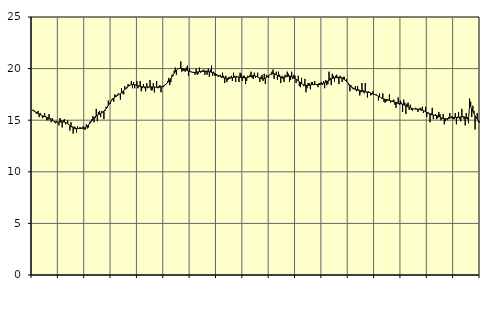
| Category | Piggar | Series 1 |
|---|---|---|
| nan | 16 | 15.95 |
| 87.0 | 16 | 15.89 |
| 87.0 | 15.9 | 15.84 |
| 87.0 | 15.7 | 15.78 |
| 87.0 | 15.6 | 15.72 |
| 87.0 | 15.9 | 15.66 |
| 87.0 | 15.3 | 15.59 |
| 87.0 | 15.7 | 15.54 |
| 87.0 | 15.5 | 15.48 |
| 87.0 | 15.2 | 15.43 |
| 87.0 | 15.3 | 15.39 |
| 87.0 | 15.7 | 15.35 |
| nan | 15.4 | 15.31 |
| 88.0 | 15 | 15.26 |
| 88.0 | 15 | 15.21 |
| 88.0 | 15.6 | 15.16 |
| 88.0 | 15.2 | 15.1 |
| 88.0 | 14.8 | 15.04 |
| 88.0 | 15.2 | 14.98 |
| 88.0 | 14.9 | 14.92 |
| 88.0 | 14.8 | 14.88 |
| 88.0 | 14.7 | 14.84 |
| 88.0 | 14.9 | 14.82 |
| 88.0 | 14.8 | 14.81 |
| nan | 14.5 | 14.81 |
| 89.0 | 15.2 | 14.82 |
| 89.0 | 15 | 14.84 |
| 89.0 | 14.3 | 14.85 |
| 89.0 | 15 | 14.84 |
| 89.0 | 15.1 | 14.82 |
| 89.0 | 14.6 | 14.79 |
| 89.0 | 14.7 | 14.73 |
| 89.0 | 15 | 14.66 |
| 89.0 | 14.6 | 14.58 |
| 89.0 | 14 | 14.49 |
| 89.0 | 14.8 | 14.4 |
| nan | 14.4 | 14.33 |
| 90.0 | 13.7 | 14.26 |
| 90.0 | 14.4 | 14.21 |
| 90.0 | 14.3 | 14.19 |
| 90.0 | 13.8 | 14.18 |
| 90.0 | 14.4 | 14.18 |
| 90.0 | 14.2 | 14.19 |
| 90.0 | 14.3 | 14.19 |
| 90.0 | 14.3 | 14.2 |
| 90.0 | 14.2 | 14.21 |
| 90.0 | 14.4 | 14.23 |
| 90.0 | 14.1 | 14.25 |
| nan | 14.1 | 14.3 |
| 91.0 | 14.6 | 14.36 |
| 91.0 | 14.2 | 14.44 |
| 91.0 | 14.3 | 14.55 |
| 91.0 | 14.8 | 14.67 |
| 91.0 | 14.9 | 14.81 |
| 91.0 | 15.1 | 14.95 |
| 91.0 | 15.4 | 15.09 |
| 91.0 | 14.8 | 15.22 |
| 91.0 | 15.2 | 15.33 |
| 91.0 | 16.1 | 15.42 |
| 91.0 | 14.9 | 15.48 |
| nan | 15.8 | 15.54 |
| 92.0 | 15.9 | 15.59 |
| 92.0 | 15.3 | 15.64 |
| 92.0 | 15.9 | 15.71 |
| 92.0 | 15.8 | 15.79 |
| 92.0 | 15.1 | 15.88 |
| 92.0 | 15.9 | 16 |
| 92.0 | 16.3 | 16.13 |
| 92.0 | 16.2 | 16.28 |
| 92.0 | 16.9 | 16.44 |
| 92.0 | 16.6 | 16.6 |
| 92.0 | 16.6 | 16.75 |
| nan | 17 | 16.9 |
| 93.0 | 17.1 | 17.03 |
| 93.0 | 16.8 | 17.14 |
| 93.0 | 17.5 | 17.23 |
| 93.0 | 17.4 | 17.3 |
| 93.0 | 17.4 | 17.37 |
| 93.0 | 17.6 | 17.44 |
| 93.0 | 17.5 | 17.51 |
| 93.0 | 17 | 17.58 |
| 93.0 | 18.1 | 17.66 |
| 93.0 | 17.6 | 17.76 |
| 93.0 | 17.5 | 17.86 |
| nan | 18.3 | 17.98 |
| 94.0 | 18 | 18.09 |
| 94.0 | 18.1 | 18.2 |
| 94.0 | 18.5 | 18.29 |
| 94.0 | 18.3 | 18.36 |
| 94.0 | 18.4 | 18.41 |
| 94.0 | 18.8 | 18.44 |
| 94.0 | 18.1 | 18.45 |
| 94.0 | 18.7 | 18.45 |
| 94.0 | 18.1 | 18.44 |
| 94.0 | 18.4 | 18.41 |
| 94.0 | 18.8 | 18.38 |
| nan | 18.1 | 18.35 |
| 95.0 | 18.3 | 18.31 |
| 95.0 | 18.8 | 18.28 |
| 95.0 | 17.8 | 18.25 |
| 95.0 | 18.1 | 18.23 |
| 95.0 | 18.5 | 18.22 |
| 95.0 | 18.1 | 18.22 |
| 95.0 | 17.8 | 18.22 |
| 95.0 | 18.6 | 18.22 |
| 95.0 | 18.1 | 18.22 |
| 95.0 | 18.2 | 18.22 |
| 95.0 | 18.9 | 18.23 |
| nan | 17.9 | 18.23 |
| 96.0 | 17.9 | 18.23 |
| 96.0 | 18.6 | 18.22 |
| 96.0 | 17.7 | 18.22 |
| 96.0 | 18.2 | 18.21 |
| 96.0 | 18.8 | 18.2 |
| 96.0 | 18.1 | 18.19 |
| 96.0 | 18.3 | 18.19 |
| 96.0 | 18.4 | 18.21 |
| 96.0 | 17.7 | 18.23 |
| 96.0 | 18.3 | 18.26 |
| 96.0 | 18.2 | 18.3 |
| nan | 18.3 | 18.36 |
| 97.0 | 18.5 | 18.43 |
| 97.0 | 18.6 | 18.52 |
| 97.0 | 18.8 | 18.64 |
| 97.0 | 19.1 | 18.77 |
| 97.0 | 18.4 | 18.91 |
| 97.0 | 18.7 | 19.06 |
| 97.0 | 19.4 | 19.22 |
| 97.0 | 19.3 | 19.39 |
| 97.0 | 19.8 | 19.55 |
| 97.0 | 20.1 | 19.7 |
| 97.0 | 19.4 | 19.83 |
| nan | 19.9 | 19.93 |
| 98.0 | 20 | 20 |
| 98.0 | 20 | 20.03 |
| 98.0 | 20.7 | 20.04 |
| 98.0 | 19.7 | 20.02 |
| 98.0 | 19.8 | 19.99 |
| 98.0 | 19.8 | 19.95 |
| 98.0 | 19.7 | 19.9 |
| 98.0 | 20.1 | 19.86 |
| 98.0 | 20.3 | 19.81 |
| 98.0 | 19.3 | 19.77 |
| 98.0 | 20 | 19.72 |
| nan | 19.7 | 19.69 |
| 99.0 | 19.7 | 19.66 |
| 99.0 | 19.6 | 19.64 |
| 99.0 | 19.6 | 19.63 |
| 99.0 | 19.4 | 19.63 |
| 99.0 | 20 | 19.64 |
| 99.0 | 19.4 | 19.66 |
| 99.0 | 19.5 | 19.69 |
| 99.0 | 20.1 | 19.71 |
| 99.0 | 19.6 | 19.72 |
| 99.0 | 19.8 | 19.73 |
| 99.0 | 19.8 | 19.73 |
| nan | 19.9 | 19.73 |
| 0.0 | 19.4 | 19.73 |
| 0.0 | 19.8 | 19.72 |
| 0.0 | 19.4 | 19.72 |
| 0.0 | 20 | 19.71 |
| 0.0 | 19.2 | 19.69 |
| 0.0 | 19.9 | 19.67 |
| 0.0 | 20.3 | 19.64 |
| 0.0 | 19.3 | 19.6 |
| 0.0 | 19.7 | 19.55 |
| 0.0 | 19.3 | 19.5 |
| 0.0 | 19.3 | 19.45 |
| nan | 19.4 | 19.4 |
| 1.0 | 19.2 | 19.35 |
| 1.0 | 19.3 | 19.3 |
| 1.0 | 19.4 | 19.25 |
| 1.0 | 19.1 | 19.21 |
| 1.0 | 19.6 | 19.17 |
| 1.0 | 19.3 | 19.13 |
| 1.0 | 18.6 | 19.1 |
| 1.0 | 19.3 | 19.07 |
| 1.0 | 18.7 | 19.05 |
| 1.0 | 18.9 | 19.05 |
| 1.0 | 19.2 | 19.06 |
| nan | 19.1 | 19.07 |
| 2.0 | 19.3 | 19.1 |
| 2.0 | 18.8 | 19.12 |
| 2.0 | 19.6 | 19.15 |
| 2.0 | 19.3 | 19.17 |
| 2.0 | 18.7 | 19.19 |
| 2.0 | 19.3 | 19.19 |
| 2.0 | 19.2 | 19.19 |
| 2.0 | 18.7 | 19.18 |
| 2.0 | 19.6 | 19.16 |
| 2.0 | 19.5 | 19.14 |
| 2.0 | 18.8 | 19.12 |
| nan | 19.3 | 19.11 |
| 3.0 | 19.3 | 19.1 |
| 3.0 | 18.5 | 19.11 |
| 3.0 | 18.8 | 19.12 |
| 3.0 | 19.3 | 19.15 |
| 3.0 | 19.2 | 19.18 |
| 3.0 | 19.4 | 19.23 |
| 3.0 | 19.7 | 19.27 |
| 3.0 | 19.1 | 19.3 |
| 3.0 | 19 | 19.32 |
| 3.0 | 19.6 | 19.31 |
| 3.0 | 19.1 | 19.28 |
| nan | 19.2 | 19.24 |
| 4.0 | 19.6 | 19.18 |
| 4.0 | 19.1 | 19.12 |
| 4.0 | 18.7 | 19.07 |
| 4.0 | 19.2 | 19.03 |
| 4.0 | 19.4 | 19.01 |
| 4.0 | 18.8 | 19.01 |
| 4.0 | 19.5 | 19.03 |
| 4.0 | 18.5 | 19.08 |
| 4.0 | 19.4 | 19.14 |
| 4.0 | 19.3 | 19.22 |
| 4.0 | 19.1 | 19.3 |
| nan | 19.4 | 19.38 |
| 5.0 | 19.5 | 19.44 |
| 5.0 | 19.7 | 19.49 |
| 5.0 | 19.9 | 19.5 |
| 5.0 | 19 | 19.5 |
| 5.0 | 19.4 | 19.46 |
| 5.0 | 19.7 | 19.4 |
| 5.0 | 18.9 | 19.34 |
| 5.0 | 19.7 | 19.27 |
| 5.0 | 19.4 | 19.22 |
| 5.0 | 18.6 | 19.18 |
| 5.0 | 19.3 | 19.16 |
| nan | 19 | 19.16 |
| 6.0 | 18.7 | 19.17 |
| 6.0 | 19.4 | 19.19 |
| 6.0 | 19.3 | 19.21 |
| 6.0 | 19.7 | 19.24 |
| 6.0 | 19.5 | 19.27 |
| 6.0 | 18.7 | 19.28 |
| 6.0 | 18.9 | 19.27 |
| 6.0 | 19.7 | 19.24 |
| 6.0 | 19 | 19.19 |
| 6.0 | 19.4 | 19.13 |
| 6.0 | 19.3 | 19.06 |
| nan | 18.6 | 18.98 |
| 7.0 | 18.9 | 18.9 |
| 7.0 | 19.3 | 18.81 |
| 7.0 | 18.3 | 18.72 |
| 7.0 | 18.2 | 18.64 |
| 7.0 | 19.1 | 18.55 |
| 7.0 | 18.5 | 18.48 |
| 7.0 | 18.3 | 18.43 |
| 7.0 | 19 | 18.4 |
| 7.0 | 17.7 | 18.38 |
| 7.0 | 18.1 | 18.38 |
| 7.0 | 18.6 | 18.39 |
| nan | 18.6 | 18.4 |
| 8.0 | 18 | 18.42 |
| 8.0 | 18.7 | 18.44 |
| 8.0 | 18.7 | 18.45 |
| 8.0 | 18.4 | 18.46 |
| 8.0 | 18.8 | 18.47 |
| 8.0 | 18.5 | 18.46 |
| 8.0 | 18.4 | 18.46 |
| 8.0 | 18.2 | 18.46 |
| 8.0 | 18.6 | 18.46 |
| 8.0 | 18.6 | 18.48 |
| 8.0 | 18.7 | 18.5 |
| nan | 18.4 | 18.54 |
| 9.0 | 18.8 | 18.58 |
| 9.0 | 18.1 | 18.63 |
| 9.0 | 18.9 | 18.68 |
| 9.0 | 18.4 | 18.74 |
| 9.0 | 18.5 | 18.8 |
| 9.0 | 19.7 | 18.87 |
| 9.0 | 19.1 | 18.93 |
| 9.0 | 18.4 | 18.99 |
| 9.0 | 19.5 | 19.04 |
| 9.0 | 19.3 | 19.08 |
| 9.0 | 18.7 | 19.1 |
| nan | 19.3 | 19.12 |
| 10.0 | 19.4 | 19.12 |
| 10.0 | 19.2 | 19.12 |
| 10.0 | 18.5 | 19.12 |
| 10.0 | 19.3 | 19.11 |
| 10.0 | 19.2 | 19.09 |
| 10.0 | 18.7 | 19.06 |
| 10.0 | 19.2 | 19.01 |
| 10.0 | 19.2 | 18.94 |
| 10.0 | 18.8 | 18.85 |
| 10.0 | 19 | 18.74 |
| 10.0 | 18.7 | 18.62 |
| nan | 18.4 | 18.5 |
| 11.0 | 17.8 | 18.38 |
| 11.0 | 18.4 | 18.27 |
| 11.0 | 18.1 | 18.18 |
| 11.0 | 18 | 18.11 |
| 11.0 | 18 | 18.05 |
| 11.0 | 18.3 | 17.99 |
| 11.0 | 17.8 | 17.96 |
| 11.0 | 18.3 | 17.92 |
| 11.0 | 18 | 17.89 |
| 11.0 | 17.4 | 17.87 |
| 11.0 | 17.7 | 17.84 |
| nan | 18.6 | 17.82 |
| 12.0 | 17.9 | 17.8 |
| 12.0 | 17.6 | 17.78 |
| 12.0 | 18.6 | 17.76 |
| 12.0 | 17.7 | 17.75 |
| 12.0 | 17.2 | 17.73 |
| 12.0 | 17.8 | 17.7 |
| 12.0 | 17.7 | 17.67 |
| 12.0 | 17.4 | 17.63 |
| 12.0 | 17.5 | 17.59 |
| 12.0 | 17.8 | 17.54 |
| 12.0 | 17.5 | 17.51 |
| nan | 17.5 | 17.47 |
| 13.0 | 17.5 | 17.43 |
| 13.0 | 17.4 | 17.39 |
| 13.0 | 16.9 | 17.33 |
| 13.0 | 17.6 | 17.27 |
| 13.0 | 17.2 | 17.2 |
| 13.0 | 17.1 | 17.15 |
| 13.0 | 17.6 | 17.09 |
| 13.0 | 16.8 | 17.05 |
| 13.0 | 16.7 | 17.02 |
| 13.0 | 16.8 | 17 |
| 13.0 | 16.9 | 16.97 |
| nan | 17 | 16.94 |
| 14.0 | 17.5 | 16.91 |
| 14.0 | 16.7 | 16.88 |
| 14.0 | 16.8 | 16.85 |
| 14.0 | 16.9 | 16.81 |
| 14.0 | 17 | 16.78 |
| 14.0 | 16.5 | 16.75 |
| 14.0 | 16.2 | 16.71 |
| 14.0 | 16.6 | 16.68 |
| 14.0 | 17.2 | 16.65 |
| 14.0 | 16.5 | 16.63 |
| 14.0 | 16.9 | 16.6 |
| nan | 16.7 | 16.58 |
| 15.0 | 15.8 | 16.54 |
| 15.0 | 17 | 16.5 |
| 15.0 | 16.7 | 16.45 |
| 15.0 | 15.6 | 16.4 |
| 15.0 | 16.6 | 16.35 |
| 15.0 | 16.7 | 16.29 |
| 15.0 | 16 | 16.25 |
| 15.0 | 16.5 | 16.2 |
| 15.0 | 16 | 16.16 |
| 15.0 | 15.9 | 16.13 |
| 15.0 | 16.1 | 16.1 |
| nan | 16.1 | 16.08 |
| 16.0 | 16.2 | 16.07 |
| 16.0 | 16.1 | 16.06 |
| 16.0 | 15.8 | 16.06 |
| 16.0 | 16.1 | 16.06 |
| 16.0 | 16.2 | 16.06 |
| 16.0 | 15.9 | 16.03 |
| 16.0 | 16.3 | 15.99 |
| 16.0 | 15.7 | 15.94 |
| 16.0 | 15.9 | 15.88 |
| 16.0 | 16.3 | 15.82 |
| 16.0 | 15.3 | 15.75 |
| nan | 15.8 | 15.69 |
| 17.0 | 15.7 | 15.63 |
| 17.0 | 14.8 | 15.58 |
| 17.0 | 15.7 | 15.54 |
| 17.0 | 16.2 | 15.52 |
| 17.0 | 15.1 | 15.5 |
| 17.0 | 15.5 | 15.48 |
| 17.0 | 15.6 | 15.47 |
| 17.0 | 15.1 | 15.45 |
| 17.0 | 15.2 | 15.41 |
| 17.0 | 15.8 | 15.36 |
| 17.0 | 15.6 | 15.31 |
| nan | 15 | 15.25 |
| 18.0 | 15.2 | 15.2 |
| 18.0 | 15.6 | 15.17 |
| 18.0 | 14.6 | 15.15 |
| 18.0 | 14.9 | 15.14 |
| 18.0 | 15.1 | 15.15 |
| 18.0 | 15 | 15.16 |
| 18.0 | 15.3 | 15.19 |
| 18.0 | 15.7 | 15.21 |
| 18.0 | 15.2 | 15.24 |
| 18.0 | 15.4 | 15.25 |
| 18.0 | 15.1 | 15.27 |
| nan | 15.1 | 15.27 |
| 19.0 | 15.7 | 15.28 |
| 19.0 | 14.6 | 15.28 |
| 19.0 | 15.2 | 15.29 |
| 19.0 | 15.8 | 15.29 |
| 19.0 | 15.1 | 15.3 |
| 19.0 | 14.9 | 15.31 |
| 19.0 | 16.1 | 15.32 |
| 19.0 | 15.4 | 15.33 |
| 19.0 | 15.1 | 15.32 |
| 19.0 | 14.5 | 15.29 |
| 19.0 | 15.7 | 15.23 |
| nan | 15.3 | 15.14 |
| 20.0 | 14.7 | 15.01 |
| 20.0 | 17.1 | 16.38 |
| 20.0 | 16.8 | 16.31 |
| 20.0 | 15.3 | 16.1 |
| 20.0 | 16.4 | 15.88 |
| 20.0 | 15.9 | 15.66 |
| 20.0 | 14.1 | 15.45 |
| 20.0 | 15.3 | 15.26 |
| 20.0 | 15.7 | 15.1 |
| 20.0 | 14.8 | 14.99 |
| 20.0 | 14.8 | 14.9 |